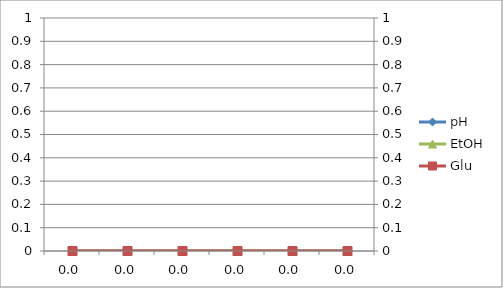
| Category | pH | EtOH |
|---|---|---|
| 0.0 | 0 | 0 |
| 0.0 | 0 | 0 |
| 0.0 | 0 | 0 |
| 0.0 | 0 | 0 |
| 0.0 | 0 | 0 |
| 0.0 | 0 | 0 |